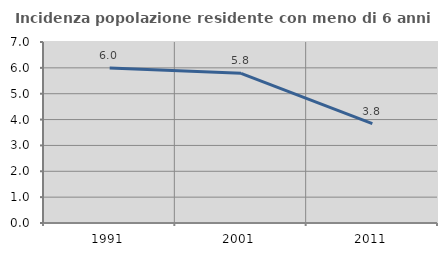
| Category | Incidenza popolazione residente con meno di 6 anni |
|---|---|
| 1991.0 | 5.993 |
| 2001.0 | 5.787 |
| 2011.0 | 3.843 |